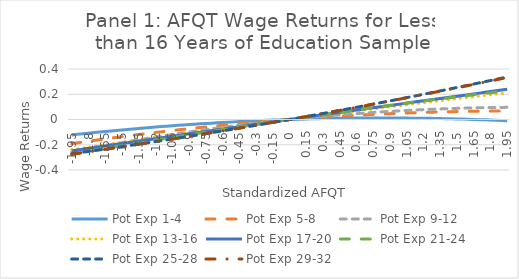
| Category | Pot Exp 1-4 | Pot Exp 5-8 | Pot Exp 9-12 | Pot Exp 13-16 | Pot Exp 17-20 | Pot Exp 21-24 | Pot Exp 25-28 | Pot Exp 29-32 |
|---|---|---|---|---|---|---|---|---|
| -1.95 | -0.123 | -0.191 | -0.257 | -0.238 | -0.248 | -0.275 | -0.271 | -0.276 |
| -1.9 | -0.118 | -0.185 | -0.248 | -0.232 | -0.242 | -0.267 | -0.265 | -0.269 |
| -1.8499999999999999 | -0.113 | -0.178 | -0.24 | -0.225 | -0.235 | -0.26 | -0.259 | -0.263 |
| -1.7999999999999998 | -0.108 | -0.172 | -0.231 | -0.219 | -0.229 | -0.252 | -0.253 | -0.256 |
| -1.7499999999999998 | -0.104 | -0.166 | -0.223 | -0.212 | -0.222 | -0.245 | -0.247 | -0.25 |
| -1.6999999999999997 | -0.099 | -0.16 | -0.215 | -0.206 | -0.216 | -0.237 | -0.24 | -0.243 |
| -1.6499999999999997 | -0.095 | -0.154 | -0.207 | -0.2 | -0.21 | -0.23 | -0.234 | -0.237 |
| -1.5999999999999996 | -0.091 | -0.148 | -0.199 | -0.193 | -0.203 | -0.222 | -0.227 | -0.23 |
| -1.5499999999999996 | -0.087 | -0.142 | -0.191 | -0.187 | -0.197 | -0.215 | -0.221 | -0.224 |
| -1.4999999999999996 | -0.082 | -0.136 | -0.183 | -0.181 | -0.19 | -0.207 | -0.215 | -0.217 |
| -1.4499999999999995 | -0.078 | -0.13 | -0.176 | -0.174 | -0.184 | -0.2 | -0.208 | -0.21 |
| -1.3999999999999995 | -0.075 | -0.125 | -0.168 | -0.168 | -0.177 | -0.193 | -0.201 | -0.204 |
| -1.3499999999999994 | -0.071 | -0.119 | -0.161 | -0.162 | -0.171 | -0.185 | -0.195 | -0.197 |
| -1.2999999999999994 | -0.067 | -0.114 | -0.153 | -0.156 | -0.165 | -0.178 | -0.188 | -0.19 |
| -1.2499999999999993 | -0.063 | -0.108 | -0.146 | -0.149 | -0.158 | -0.171 | -0.181 | -0.183 |
| -1.1999999999999993 | -0.06 | -0.103 | -0.139 | -0.143 | -0.152 | -0.164 | -0.175 | -0.176 |
| -1.1499999999999992 | -0.056 | -0.098 | -0.132 | -0.137 | -0.145 | -0.156 | -0.168 | -0.169 |
| -1.0999999999999992 | -0.053 | -0.093 | -0.125 | -0.131 | -0.139 | -0.149 | -0.161 | -0.162 |
| -1.0499999999999992 | -0.05 | -0.087 | -0.118 | -0.125 | -0.133 | -0.142 | -0.154 | -0.155 |
| -0.9999999999999991 | -0.046 | -0.082 | -0.112 | -0.119 | -0.126 | -0.135 | -0.147 | -0.148 |
| -0.9499999999999991 | -0.043 | -0.078 | -0.105 | -0.113 | -0.12 | -0.128 | -0.14 | -0.141 |
| -0.899999999999999 | -0.04 | -0.073 | -0.099 | -0.106 | -0.113 | -0.121 | -0.133 | -0.134 |
| -0.849999999999999 | -0.037 | -0.068 | -0.092 | -0.1 | -0.107 | -0.114 | -0.126 | -0.127 |
| -0.7999999999999989 | -0.034 | -0.063 | -0.086 | -0.094 | -0.101 | -0.107 | -0.119 | -0.12 |
| -0.7499999999999989 | -0.031 | -0.059 | -0.08 | -0.088 | -0.094 | -0.1 | -0.112 | -0.113 |
| -0.6999999999999988 | -0.029 | -0.054 | -0.074 | -0.082 | -0.088 | -0.093 | -0.105 | -0.106 |
| -0.6499999999999988 | -0.026 | -0.05 | -0.068 | -0.076 | -0.082 | -0.086 | -0.098 | -0.098 |
| -0.5999999999999988 | -0.024 | -0.046 | -0.062 | -0.07 | -0.075 | -0.08 | -0.09 | -0.091 |
| -0.5499999999999987 | -0.021 | -0.041 | -0.056 | -0.064 | -0.069 | -0.073 | -0.083 | -0.084 |
| -0.4999999999999987 | -0.019 | -0.037 | -0.051 | -0.058 | -0.063 | -0.066 | -0.076 | -0.076 |
| -0.44999999999999873 | -0.017 | -0.033 | -0.045 | -0.052 | -0.056 | -0.059 | -0.068 | -0.069 |
| -0.39999999999999875 | -0.014 | -0.029 | -0.04 | -0.047 | -0.05 | -0.053 | -0.061 | -0.061 |
| -0.34999999999999876 | -0.012 | -0.025 | -0.034 | -0.041 | -0.044 | -0.046 | -0.054 | -0.054 |
| -0.29999999999999877 | -0.01 | -0.021 | -0.029 | -0.035 | -0.038 | -0.039 | -0.046 | -0.046 |
| -0.24999999999999878 | -0.008 | -0.018 | -0.024 | -0.029 | -0.031 | -0.033 | -0.038 | -0.039 |
| -0.1999999999999988 | -0.006 | -0.014 | -0.019 | -0.023 | -0.025 | -0.026 | -0.031 | -0.031 |
| -0.1499999999999988 | -0.005 | -0.01 | -0.014 | -0.017 | -0.019 | -0.019 | -0.023 | -0.023 |
| -0.0999999999999988 | -0.003 | -0.007 | -0.009 | -0.012 | -0.013 | -0.013 | -0.016 | -0.016 |
| -0.049999999999998795 | -0.001 | -0.003 | -0.005 | -0.006 | -0.006 | -0.006 | -0.008 | -0.008 |
| 0.0 | 0 | 0 | 0 | 0 | 0 | 0 | 0 | 0 |
| 0.05 | 0.001 | 0.003 | 0.004 | 0.006 | 0.006 | 0.006 | 0.008 | 0.008 |
| 0.1 | 0.003 | 0.006 | 0.009 | 0.011 | 0.012 | 0.013 | 0.016 | 0.016 |
| 0.15000000000000002 | 0.004 | 0.01 | 0.013 | 0.017 | 0.019 | 0.019 | 0.024 | 0.024 |
| 0.2 | 0.005 | 0.013 | 0.017 | 0.023 | 0.025 | 0.026 | 0.032 | 0.032 |
| 0.25 | 0.006 | 0.016 | 0.021 | 0.029 | 0.031 | 0.032 | 0.04 | 0.039 |
| 0.3 | 0.007 | 0.018 | 0.025 | 0.034 | 0.037 | 0.038 | 0.048 | 0.047 |
| 0.35 | 0.008 | 0.021 | 0.029 | 0.04 | 0.044 | 0.044 | 0.056 | 0.056 |
| 0.39999999999999997 | 0.009 | 0.024 | 0.033 | 0.045 | 0.05 | 0.051 | 0.064 | 0.064 |
| 0.44999999999999996 | 0.009 | 0.026 | 0.036 | 0.051 | 0.056 | 0.057 | 0.072 | 0.072 |
| 0.49999999999999994 | 0.01 | 0.029 | 0.04 | 0.057 | 0.062 | 0.063 | 0.08 | 0.08 |
| 0.5499999999999999 | 0.011 | 0.031 | 0.043 | 0.062 | 0.068 | 0.069 | 0.088 | 0.088 |
| 0.6 | 0.011 | 0.034 | 0.047 | 0.068 | 0.075 | 0.075 | 0.097 | 0.096 |
| 0.65 | 0.011 | 0.036 | 0.05 | 0.073 | 0.081 | 0.081 | 0.105 | 0.105 |
| 0.7000000000000001 | 0.012 | 0.038 | 0.053 | 0.079 | 0.087 | 0.087 | 0.113 | 0.113 |
| 0.7500000000000001 | 0.012 | 0.04 | 0.056 | 0.084 | 0.093 | 0.093 | 0.122 | 0.121 |
| 0.8000000000000002 | 0.012 | 0.043 | 0.059 | 0.09 | 0.099 | 0.099 | 0.13 | 0.13 |
| 0.8500000000000002 | 0.012 | 0.044 | 0.062 | 0.095 | 0.105 | 0.105 | 0.139 | 0.138 |
| 0.9000000000000002 | 0.012 | 0.046 | 0.064 | 0.101 | 0.112 | 0.111 | 0.147 | 0.146 |
| 0.9500000000000003 | 0.012 | 0.048 | 0.067 | 0.106 | 0.118 | 0.117 | 0.156 | 0.155 |
| 1.0000000000000002 | 0.012 | 0.05 | 0.069 | 0.111 | 0.124 | 0.123 | 0.165 | 0.164 |
| 1.0500000000000003 | 0.011 | 0.052 | 0.072 | 0.117 | 0.13 | 0.129 | 0.173 | 0.172 |
| 1.1000000000000003 | 0.011 | 0.053 | 0.074 | 0.122 | 0.136 | 0.134 | 0.182 | 0.181 |
| 1.1500000000000004 | 0.01 | 0.055 | 0.076 | 0.127 | 0.142 | 0.14 | 0.191 | 0.189 |
| 1.2000000000000004 | 0.01 | 0.056 | 0.078 | 0.133 | 0.148 | 0.146 | 0.2 | 0.198 |
| 1.2500000000000004 | 0.009 | 0.057 | 0.08 | 0.138 | 0.154 | 0.152 | 0.209 | 0.207 |
| 1.3000000000000005 | 0.008 | 0.059 | 0.082 | 0.143 | 0.16 | 0.157 | 0.217 | 0.216 |
| 1.3500000000000005 | 0.007 | 0.06 | 0.084 | 0.149 | 0.167 | 0.163 | 0.226 | 0.224 |
| 1.4000000000000006 | 0.006 | 0.061 | 0.085 | 0.154 | 0.173 | 0.169 | 0.235 | 0.233 |
| 1.4500000000000006 | 0.005 | 0.062 | 0.087 | 0.159 | 0.179 | 0.174 | 0.244 | 0.242 |
| 1.5000000000000007 | 0.004 | 0.063 | 0.088 | 0.164 | 0.185 | 0.18 | 0.253 | 0.251 |
| 1.5500000000000007 | 0.003 | 0.063 | 0.09 | 0.17 | 0.191 | 0.185 | 0.263 | 0.26 |
| 1.6000000000000008 | 0.002 | 0.064 | 0.091 | 0.175 | 0.197 | 0.191 | 0.272 | 0.269 |
| 1.6500000000000008 | 0 | 0.065 | 0.092 | 0.18 | 0.203 | 0.196 | 0.281 | 0.278 |
| 1.7000000000000008 | -0.001 | 0.065 | 0.093 | 0.185 | 0.209 | 0.202 | 0.29 | 0.287 |
| 1.7500000000000009 | -0.003 | 0.066 | 0.094 | 0.19 | 0.215 | 0.207 | 0.299 | 0.296 |
| 1.800000000000001 | -0.004 | 0.066 | 0.095 | 0.195 | 0.221 | 0.212 | 0.309 | 0.305 |
| 1.850000000000001 | -0.006 | 0.067 | 0.095 | 0.2 | 0.227 | 0.218 | 0.318 | 0.314 |
| 1.900000000000001 | -0.008 | 0.067 | 0.096 | 0.205 | 0.233 | 0.223 | 0.328 | 0.324 |
| 1.950000000000001 | -0.01 | 0.067 | 0.096 | 0.21 | 0.239 | 0.228 | 0.337 | 0.333 |